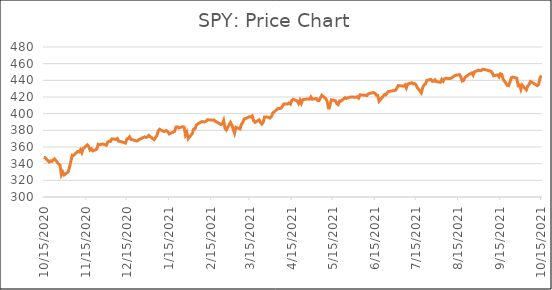
| Category | Series 0 |
|---|---|
| 10/15/20 | 347.5 |
| 10/16/20 | 347.29 |
| 10/19/20 | 342.01 |
| 10/20/20 | 343.38 |
| 10/21/20 | 342.73 |
| 10/22/20 | 344.61 |
| 10/23/20 | 345.78 |
| 10/26/20 | 339.39 |
| 10/27/20 | 338.22 |
| 10/28/20 | 326.66 |
| 10/29/20 | 329.98 |
| 10/30/20 | 326.54 |
| 11/2/20 | 330.2 |
| 11/3/20 | 336.03 |
| 11/4/20 | 343.54 |
| 11/5/20 | 350.24 |
| 11/6/20 | 350.16 |
| 11/9/20 | 354.56 |
| 11/10/20 | 354.04 |
| 11/11/20 | 356.67 |
| 11/12/20 | 353.21 |
| 11/13/20 | 358.1 |
| 11/16/20 | 362.57 |
| 11/17/20 | 360.62 |
| 11/18/20 | 356.28 |
| 11/19/20 | 357.78 |
| 11/20/20 | 355.33 |
| 11/23/20 | 357.46 |
| 11/24/20 | 363.22 |
| 11/25/20 | 362.66 |
| 11/27/20 | 363.67 |
| 11/30/20 | 362.06 |
| 12/1/20 | 366.02 |
| 12/2/20 | 366.79 |
| 12/3/20 | 366.69 |
| 12/4/20 | 369.85 |
| 12/7/20 | 369.09 |
| 12/8/20 | 370.17 |
| 12/9/20 | 366.85 |
| 12/10/20 | 366.73 |
| 12/11/20 | 366.3 |
| 12/14/20 | 364.66 |
| 12/15/20 | 369.59 |
| 12/16/20 | 370.17 |
| 12/17/20 | 372.24 |
| 12/18/20 | 369.18 |
| 12/21/20 | 367.86 |
| 12/22/20 | 367.24 |
| 12/23/20 | 367.57 |
| 12/24/20 | 369 |
| 12/28/20 | 372.17 |
| 12/29/20 | 371.46 |
| 12/30/20 | 371.99 |
| 12/31/20 | 373.88 |
| 1/4/21 | 368.79 |
| 1/5/21 | 371.33 |
| 1/6/21 | 373.55 |
| 1/7/21 | 379.1 |
| 1/8/21 | 381.26 |
| 1/11/21 | 378.69 |
| 1/12/21 | 378.77 |
| 1/13/21 | 379.79 |
| 1/14/21 | 378.46 |
| 1/15/21 | 375.7 |
| 1/19/21 | 378.65 |
| 1/20/21 | 383.89 |
| 1/21/21 | 384.24 |
| 1/22/21 | 382.88 |
| 1/25/21 | 384.39 |
| 1/26/21 | 383.79 |
| 1/27/21 | 374.41 |
| 1/28/21 | 377.63 |
| 1/29/21 | 370.07 |
| 2/1/21 | 376.23 |
| 2/2/21 | 381.55 |
| 2/3/21 | 381.85 |
| 2/4/21 | 386.19 |
| 2/5/21 | 387.71 |
| 2/8/21 | 390.51 |
| 2/9/21 | 390.25 |
| 2/10/21 | 390.08 |
| 2/11/21 | 390.71 |
| 2/12/21 | 392.64 |
| 2/16/21 | 392.3 |
| 2/17/21 | 392.39 |
| 2/18/21 | 390.72 |
| 2/19/21 | 390.03 |
| 2/22/21 | 387.03 |
| 2/23/21 | 387.5 |
| 2/24/21 | 391.77 |
| 2/25/21 | 382.33 |
| 2/26/21 | 380.36 |
| 3/1/21 | 389.58 |
| 3/2/21 | 386.54 |
| 3/3/21 | 381.42 |
| 3/4/21 | 376.7 |
| 3/5/21 | 383.63 |
| 3/8/21 | 381.72 |
| 3/9/21 | 387.17 |
| 3/10/21 | 389.58 |
| 3/11/21 | 393.53 |
| 3/12/21 | 394.06 |
| 3/15/21 | 396.41 |
| 3/16/21 | 395.91 |
| 3/17/21 | 397.26 |
| 3/18/21 | 391.48 |
| 3/19/21 | 389.48 |
| 3/22/21 | 392.59 |
| 3/23/21 | 389.5 |
| 3/24/21 | 387.52 |
| 3/25/21 | 389.7 |
| 3/26/21 | 395.98 |
| 3/29/21 | 395.78 |
| 3/30/21 | 394.73 |
| 3/31/21 | 396.33 |
| 4/1/21 | 400.61 |
| 4/5/21 | 406.36 |
| 4/6/21 | 406.12 |
| 4/7/21 | 406.59 |
| 4/8/21 | 408.52 |
| 4/9/21 | 411.49 |
| 4/12/21 | 411.64 |
| 4/13/21 | 412.86 |
| 4/14/21 | 411.45 |
| 4/15/21 | 415.87 |
| 4/16/21 | 417.26 |
| 4/19/21 | 415.21 |
| 4/20/21 | 412.17 |
| 4/21/21 | 416.07 |
| 4/22/21 | 412.27 |
| 4/23/21 | 416.74 |
| 4/26/21 | 417.61 |
| 4/27/21 | 417.52 |
| 4/28/21 | 417.4 |
| 4/29/21 | 420.06 |
| 4/30/21 | 417.3 |
| 5/3/21 | 418.2 |
| 5/4/21 | 415.62 |
| 5/5/21 | 415.75 |
| 5/6/21 | 419.07 |
| 5/7/21 | 422.12 |
| 5/10/21 | 417.94 |
| 5/11/21 | 414.21 |
| 5/12/21 | 405.41 |
| 5/13/21 | 410.28 |
| 5/14/21 | 416.58 |
| 5/17/21 | 415.52 |
| 5/18/21 | 411.94 |
| 5/19/21 | 410.86 |
| 5/20/21 | 415.28 |
| 5/21/21 | 414.94 |
| 5/24/21 | 419.17 |
| 5/25/21 | 418.24 |
| 5/26/21 | 419.07 |
| 5/27/21 | 419.29 |
| 5/28/21 | 420.04 |
| 6/1/21 | 419.67 |
| 6/2/21 | 420.33 |
| 6/3/21 | 418.77 |
| 6/4/21 | 422.6 |
| 6/7/21 | 422.19 |
| 6/8/21 | 422.28 |
| 6/9/21 | 421.65 |
| 6/10/21 | 423.61 |
| 6/11/21 | 424.31 |
| 6/14/21 | 425.26 |
| 6/15/21 | 424.48 |
| 6/16/21 | 422.11 |
| 6/17/21 | 421.97 |
| 6/18/21 | 414.92 |
| 6/21/21 | 420.86 |
| 6/22/21 | 423.11 |
| 6/23/21 | 422.6 |
| 6/24/21 | 425.1 |
| 6/25/21 | 426.61 |
| 6/28/21 | 427.47 |
| 6/29/21 | 427.7 |
| 6/30/21 | 428.06 |
| 7/1/21 | 430.43 |
| 7/2/21 | 433.72 |
| 7/6/21 | 432.93 |
| 7/7/21 | 434.46 |
| 7/8/21 | 430.92 |
| 7/9/21 | 435.52 |
| 7/12/21 | 437.08 |
| 7/13/21 | 435.59 |
| 7/14/21 | 436.24 |
| 7/15/21 | 434.75 |
| 7/16/21 | 431.34 |
| 7/19/21 | 424.97 |
| 7/20/21 | 431.06 |
| 7/21/21 | 434.55 |
| 7/22/21 | 435.46 |
| 7/23/21 | 439.94 |
| 7/26/21 | 441.02 |
| 7/27/21 | 439.01 |
| 7/28/21 | 438.83 |
| 7/29/21 | 440.65 |
| 7/30/21 | 438.51 |
| 8/2/21 | 437.59 |
| 8/3/21 | 441.15 |
| 8/4/21 | 438.98 |
| 8/5/21 | 441.76 |
| 8/6/21 | 442.49 |
| 8/9/21 | 442.13 |
| 8/10/21 | 442.68 |
| 8/11/21 | 443.78 |
| 8/12/21 | 445.11 |
| 8/13/21 | 445.92 |
| 8/16/21 | 446.97 |
| 8/17/21 | 444.04 |
| 8/18/21 | 439.18 |
| 8/19/21 | 439.86 |
| 8/20/21 | 443.36 |
| 8/23/21 | 447.26 |
| 8/24/21 | 447.97 |
| 8/25/21 | 448.91 |
| 8/26/21 | 446.26 |
| 8/27/21 | 450.25 |
| 8/30/21 | 452.23 |
| 8/31/21 | 451.56 |
| 9/1/21 | 451.8 |
| 9/2/21 | 453.19 |
| 9/3/21 | 453.08 |
| 9/7/21 | 451.46 |
| 9/8/21 | 450.91 |
| 9/9/21 | 448.98 |
| 9/10/21 | 445.44 |
| 9/13/21 | 446.58 |
| 9/14/21 | 444.17 |
| 9/15/21 | 447.88 |
| 9/16/21 | 447.17 |
| 9/17/21 | 441.4 |
| 9/20/21 | 434.04 |
| 9/21/21 | 433.63 |
| 9/22/21 | 437.86 |
| 9/23/21 | 443.18 |
| 9/24/21 | 443.91 |
| 9/27/21 | 442.64 |
| 9/28/21 | 433.72 |
| 9/29/21 | 434.45 |
| 9/30/21 | 429.14 |
| 10/1/21 | 434.24 |
| 10/4/21 | 428.64 |
| 10/5/21 | 433.1 |
| 10/6/21 | 434.9 |
| 10/7/21 | 438.66 |
| 10/8/21 | 437.86 |
| 10/11/21 | 434.69 |
| 10/12/21 | 433.62 |
| 10/13/21 | 435.18 |
| 10/14/21 | 442.5 |
| 10/15/21 | 445.87 |